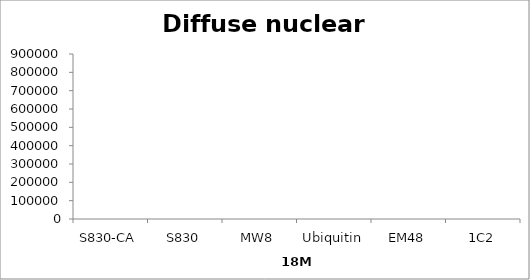
| Category | Series 0 |
|---|---|
| S830-CA | 0 |
| S830 | 0 |
| MW8 | 0 |
| Ubiquitin | 0 |
| EM48 | 0 |
| 1C2 | 0 |